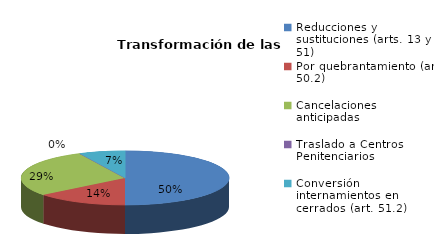
| Category | Series 0 |
|---|---|
| Reducciones y sustituciones (arts. 13 y 51) | 7 |
| Por quebrantamiento (art. 50.2) | 2 |
| Cancelaciones anticipadas | 4 |
| Traslado a Centros Penitenciarios | 0 |
| Conversión internamientos en cerrados (art. 51.2) | 1 |